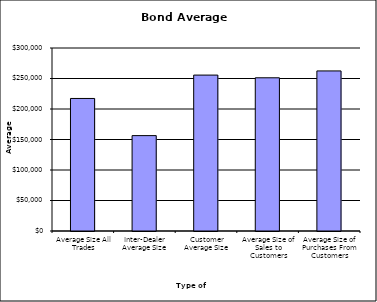
| Category | Security Type |
|---|---|
| Average Size All Trades | 217282.912 |
| Inter-Dealer Average Size | 156353.12 |
| Customer Average Size | 255594.59 |
| Average Size of Sales to Customers | 251166.209 |
| Average Size of Purchases From Customers | 262401.141 |